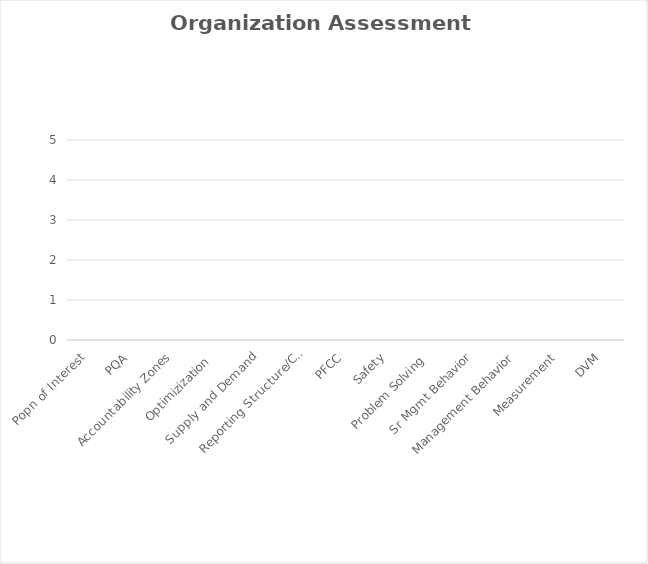
| Category | Team A |
|---|---|
| Popn of Interest | 0 |
| PQA | 0 |
| Accountability Zones | 0 |
| Optimizization  | 0 |
| Supply and Demand | 0 |
| Reporting Structure/Clarity | 0 |
| PFCC | 0 |
| Safety | 0 |
| Problem Solving  | 0 |
| Sr Mgmt Behavior | 0 |
| Management Behavior | 0 |
| Measurement | 0 |
| DVM | 0 |